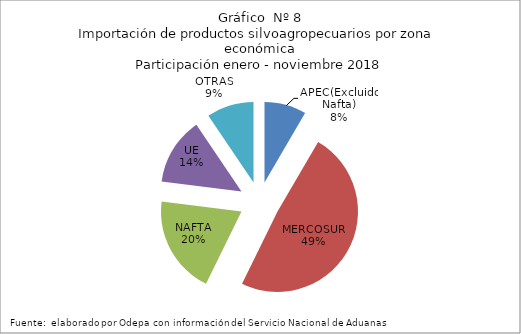
| Category | Series 0 |
|---|---|
| APEC(Excluido Nafta) | 505342.961 |
| MERCOSUR | 2933321.489 |
| NAFTA | 1184195.358 |
| UE | 814022.723 |
| OTRAS | 568539.469 |